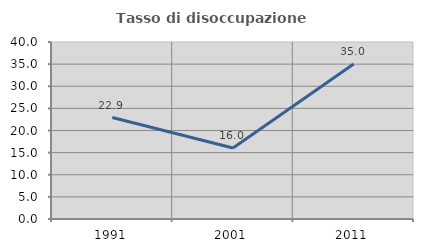
| Category | Tasso di disoccupazione giovanile  |
|---|---|
| 1991.0 | 22.936 |
| 2001.0 | 16.049 |
| 2011.0 | 35.036 |